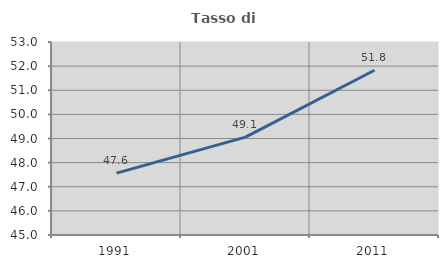
| Category | Tasso di occupazione   |
|---|---|
| 1991.0 | 47.566 |
| 2001.0 | 49.058 |
| 2011.0 | 51.828 |